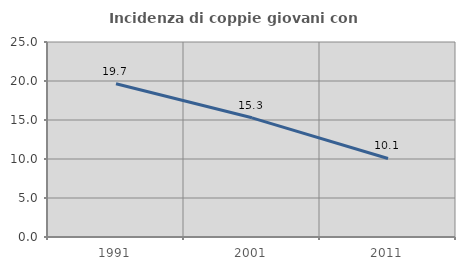
| Category | Incidenza di coppie giovani con figli |
|---|---|
| 1991.0 | 19.651 |
| 2001.0 | 15.279 |
| 2011.0 | 10.066 |